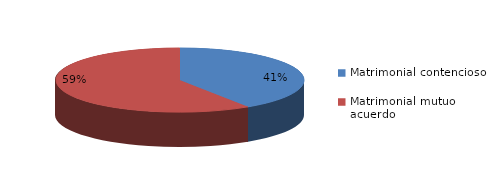
| Category | Series 0 |
|---|---|
| 0 | 167 |
| 1 | 243 |